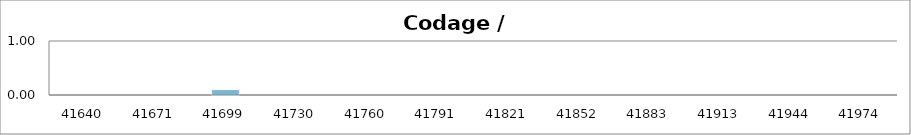
| Category | Codage / Software |
|---|---|
| 2014-01-01 | 0 |
| 2014-02-01 | 0 |
| 2014-03-01 | 0.1 |
| 2014-04-01 | 0 |
| 2014-05-01 | 0 |
| 2014-06-01 | 0 |
| 2014-07-01 | 0 |
| 2014-08-01 | 0 |
| 2014-09-01 | 0 |
| 2014-10-01 | 0 |
| 2014-11-01 | 0 |
| 2014-12-01 | 0 |